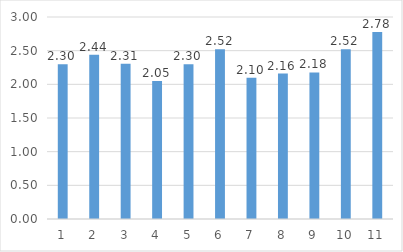
| Category | Series 0 |
|---|---|
| 0 | 2.299 |
| 1 | 2.441 |
| 2 | 2.306 |
| 3 | 2.049 |
| 4 | 2.298 |
| 5 | 2.523 |
| 6 | 2.097 |
| 7 | 2.161 |
| 8 | 2.177 |
| 9 | 2.52 |
| 10 | 2.778 |